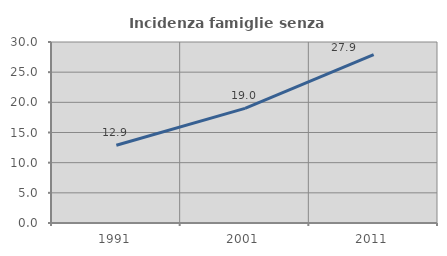
| Category | Incidenza famiglie senza nuclei |
|---|---|
| 1991.0 | 12.883 |
| 2001.0 | 19.004 |
| 2011.0 | 27.922 |